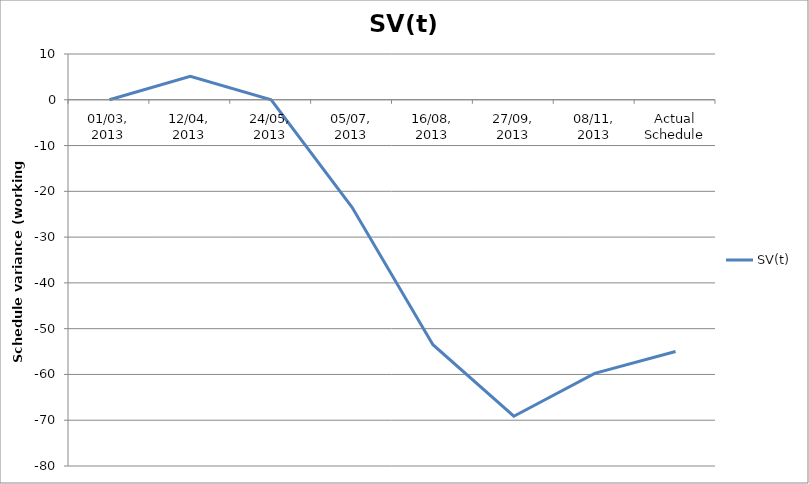
| Category | SV(t) |
|---|---|
| 01/03, 2013 | 0 |
| 12/04, 2013 | 5.125 |
| 24/05, 2013 | 0 |
| 05/07, 2013 | -23.5 |
| 16/08, 2013 | -53.5 |
| 27/09, 2013 | -69.125 |
| 08/11, 2013 | -59.75 |
| Actual Schedule | -55 |